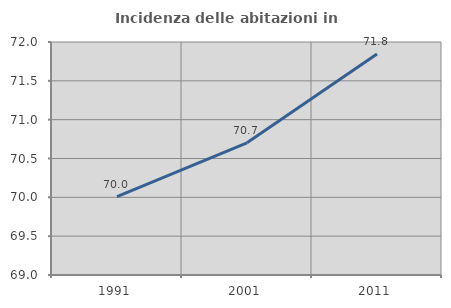
| Category | Incidenza delle abitazioni in proprietà  |
|---|---|
| 1991.0 | 70.01 |
| 2001.0 | 70.702 |
| 2011.0 | 71.845 |